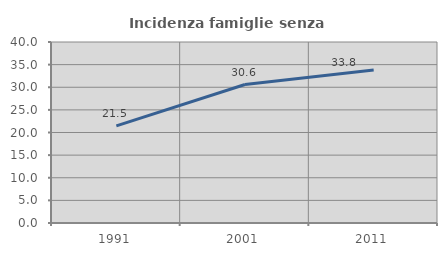
| Category | Incidenza famiglie senza nuclei |
|---|---|
| 1991.0 | 21.461 |
| 2001.0 | 30.601 |
| 2011.0 | 33.826 |